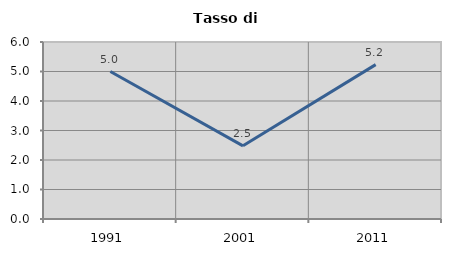
| Category | Tasso di disoccupazione   |
|---|---|
| 1991.0 | 5 |
| 2001.0 | 2.481 |
| 2011.0 | 5.233 |